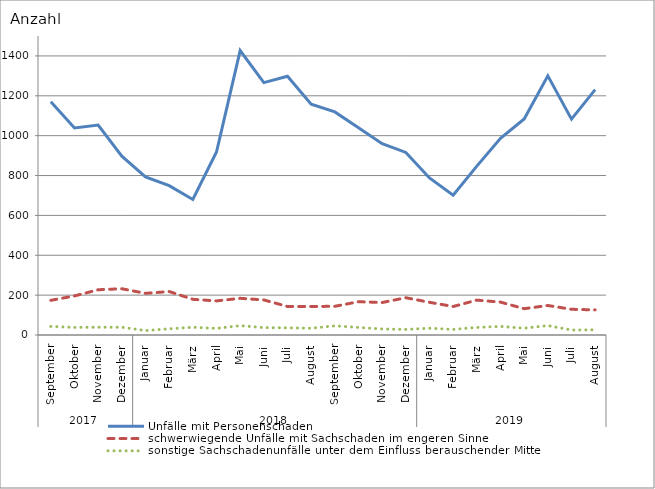
| Category | Unfälle mit Personenschaden | schwerwiegende Unfälle mit Sachschaden im engeren Sinne | sonstige Sachschadenunfälle unter dem Einfluss berauschender Mittel |
|---|---|---|---|
| 0 | 1170 | 174 | 43 |
| 1 | 1039 | 196 | 38 |
| 2 | 1053 | 227 | 39 |
| 3 | 897 | 232 | 39 |
| 4 | 793 | 209 | 22 |
| 5 | 749 | 218 | 31 |
| 6 | 680 | 179 | 39 |
| 7 | 918 | 171 | 33 |
| 8 | 1427 | 184 | 47 |
| 9 | 1266 | 176 | 37 |
| 10 | 1298 | 143 | 36 |
| 11 | 1158 | 143 | 34 |
| 12 | 1119 | 144 | 46 |
| 13 | 1040 | 167 | 38 |
| 14 | 960 | 163 | 30 |
| 15 | 916 | 187 | 28 |
| 16 | 788 | 164 | 34 |
| 17 | 701 | 143 | 28 |
| 18 | 847 | 175 | 38 |
| 19 | 987 | 165 | 43 |
| 20 | 1084 | 132 | 34 |
| 21 | 1300 | 148 | 47 |
| 22 | 1083 | 129 | 25 |
| 23 | 1231 | 126 | 26 |